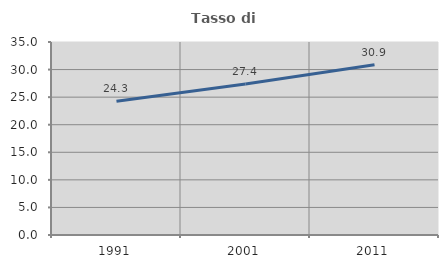
| Category | Tasso di occupazione   |
|---|---|
| 1991.0 | 24.264 |
| 2001.0 | 27.377 |
| 2011.0 | 30.876 |